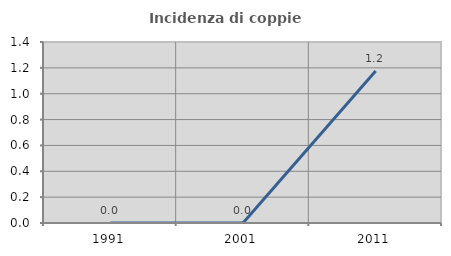
| Category | Incidenza di coppie miste |
|---|---|
| 1991.0 | 0 |
| 2001.0 | 0 |
| 2011.0 | 1.176 |